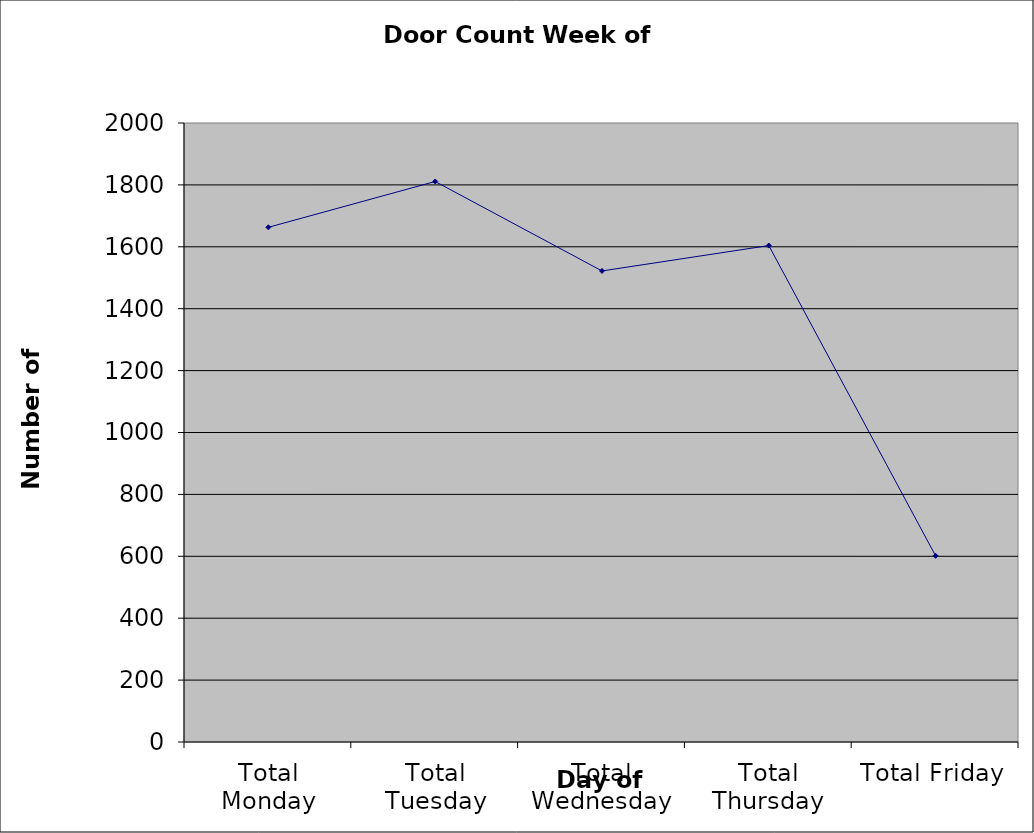
| Category | Series 0 |
|---|---|
| Total Monday | 1663 |
| Total Tuesday | 1811 |
| Total Wednesday | 1522 |
| Total Thursday | 1604 |
| Total Friday | 601.5 |